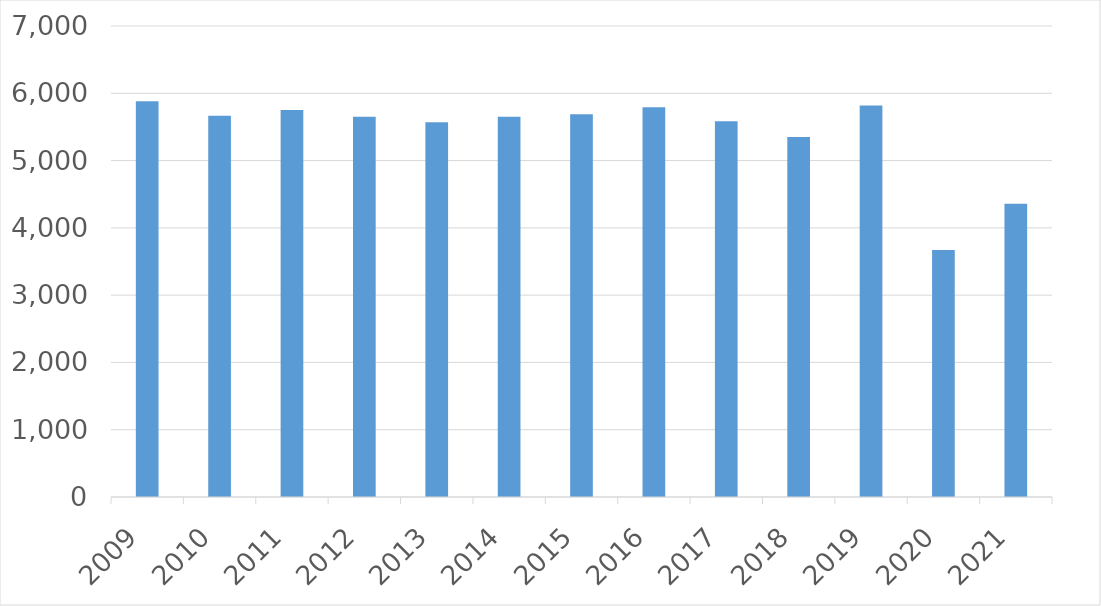
| Category | Series 0 |
|---|---|
| 2009 | 5880 |
| 2010 | 5667 |
| 2011 | 5752 |
| 2012 | 5650 |
| 2013 | 5569 |
| 2014 | 5651 |
| 2015 | 5689 |
| 2016 | 5792 |
| 2017 | 5584 |
| 2018 | 5349 |
| 2019 | 5819 |
| 2020 | 3671 |
| 2021 | 4358 |